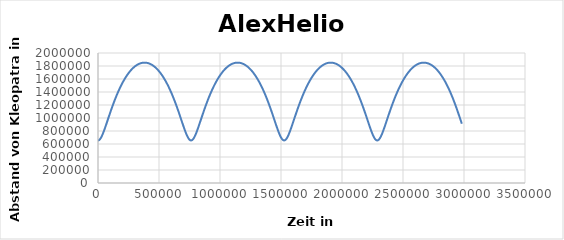
| Category | AlexHelios |
|---|---|
| 0.0 | 655000 |
| 3000.0 | 655668.459 |
| 6000.0 | 657666.917 |
| 9000.0 | 660974.897 |
| 12000.0 | 665559.148 |
| 15000.0 | 671374.895 |
| 18000.0 | 678367.433 |
| 21000.0 | 686473.949 |
| 24000.0 | 695625.447 |
| 27000.0 | 705748.665 |
| 30000.0 | 716767.876 |
| 33000.0 | 728606.511 |
| 36000.0 | 741188.56 |
| 39000.0 | 754439.718 |
| 42000.0 | 768288.295 |
| 45000.0 | 782665.887 |
| 48000.0 | 797507.843 |
| 51000.0 | 812753.552 |
| 54000.0 | 828346.585 |
| 57000.0 | 844234.711 |
| 60000.0 | 860369.83 |
| 63000.0 | 876707.841 |
| 66000.0 | 893208.449 |
| 69000.0 | 909834.961 |
| 72000.0 | 926554.046 |
| 75000.0 | 943335.501 |
| 78000.0 | 960152.01 |
| 81000.0 | 976978.912 |
| 84000.0 | 993793.973 |
| 87000.0 | 1010577.176 |
| 90000.0 | 1027310.524 |
| 93000.0 | 1043977.849 |
| 96000.0 | 1060564.643 |
| 99000.0 | 1077057.905 |
| 102000.0 | 1093445.988 |
| 105000.0 | 1109718.476 |
| 108000.0 | 1125866.06 |
| 111000.0 | 1141880.431 |
| 114000.0 | 1157754.18 |
| 117000.0 | 1173480.712 |
| 120000.0 | 1189054.166 |
| 123000.0 | 1204469.337 |
| 126000.0 | 1219721.62 |
| 129000.0 | 1234806.941 |
| 132000.0 | 1249721.713 |
| 135000.0 | 1264462.783 |
| 138000.0 | 1279027.388 |
| 141000.0 | 1293413.119 |
| 144000.0 | 1307617.887 |
| 147000.0 | 1321639.888 |
| 150000.0 | 1335477.575 |
| 153000.0 | 1349129.636 |
| 156000.0 | 1362594.964 |
| 159000.0 | 1375872.644 |
| 162000.0 | 1388961.928 |
| 165000.0 | 1401862.22 |
| 168000.0 | 1414573.062 |
| 171000.0 | 1427094.118 |
| 174000.0 | 1439425.161 |
| 177000.0 | 1451566.063 |
| 180000.0 | 1463516.784 |
| 183000.0 | 1475277.363 |
| 186000.0 | 1486847.91 |
| 189000.0 | 1498228.594 |
| 192000.0 | 1509419.644 |
| 195000.0 | 1520421.334 |
| 198000.0 | 1531233.984 |
| 201000.0 | 1541857.951 |
| 204000.0 | 1552293.624 |
| 207000.0 | 1562541.424 |
| 210000.0 | 1572601.793 |
| 213000.0 | 1582475.198 |
| 216000.0 | 1592162.121 |
| 219000.0 | 1601663.063 |
| 222000.0 | 1610978.534 |
| 225000.0 | 1620109.054 |
| 228000.0 | 1629055.155 |
| 231000.0 | 1637817.369 |
| 234000.0 | 1646396.237 |
| 237000.0 | 1654792.299 |
| 240000.0 | 1663006.097 |
| 243000.0 | 1671038.172 |
| 246000.0 | 1678889.064 |
| 249000.0 | 1686559.309 |
| 252000.0 | 1694049.439 |
| 255000.0 | 1701359.981 |
| 258000.0 | 1708491.457 |
| 261000.0 | 1715444.382 |
| 264000.0 | 1722219.261 |
| 267000.0 | 1728816.596 |
| 270000.0 | 1735236.875 |
| 273000.0 | 1741480.582 |
| 276000.0 | 1747548.187 |
| 279000.0 | 1753440.152 |
| 282000.0 | 1759156.929 |
| 285000.0 | 1764698.958 |
| 288000.0 | 1770066.669 |
| 291000.0 | 1775260.479 |
| 294000.0 | 1780280.796 |
| 297000.0 | 1785128.013 |
| 300000.0 | 1789802.514 |
| 303000.0 | 1794304.667 |
| 306000.0 | 1798634.831 |
| 309000.0 | 1802793.35 |
| 312000.0 | 1806780.558 |
| 315000.0 | 1810596.772 |
| 318000.0 | 1814242.301 |
| 321000.0 | 1817717.436 |
| 324000.0 | 1821022.458 |
| 327000.0 | 1824157.635 |
| 330000.0 | 1827123.219 |
| 333000.0 | 1829919.451 |
| 336000.0 | 1832546.557 |
| 339000.0 | 1835004.752 |
| 342000.0 | 1837294.235 |
| 345000.0 | 1839415.192 |
| 348000.0 | 1841367.796 |
| 351000.0 | 1843152.207 |
| 354000.0 | 1844768.569 |
| 357000.0 | 1846217.016 |
| 360000.0 | 1847497.665 |
| 363000.0 | 1848610.621 |
| 366000.0 | 1849555.975 |
| 369000.0 | 1850333.804 |
| 372000.0 | 1850944.172 |
| 375000.0 | 1851387.129 |
| 378000.0 | 1851662.712 |
| 381000.0 | 1851770.942 |
| 384000.0 | 1851711.829 |
| 387000.0 | 1851485.367 |
| 390000.0 | 1851091.539 |
| 393000.0 | 1850530.312 |
| 396000.0 | 1849801.64 |
| 399000.0 | 1848905.463 |
| 402000.0 | 1847841.708 |
| 405000.0 | 1846610.289 |
| 408000.0 | 1845211.104 |
| 411000.0 | 1843644.039 |
| 414000.0 | 1841908.966 |
| 417000.0 | 1840005.744 |
| 420000.0 | 1837934.217 |
| 423000.0 | 1835694.217 |
| 426000.0 | 1833285.56 |
| 429000.0 | 1830708.052 |
| 432000.0 | 1827961.483 |
| 435000.0 | 1825045.629 |
| 438000.0 | 1821960.255 |
| 441000.0 | 1818705.111 |
| 444000.0 | 1815279.934 |
| 447000.0 | 1811684.447 |
| 450000.0 | 1807918.361 |
| 453000.0 | 1803981.374 |
| 456000.0 | 1799873.17 |
| 459000.0 | 1795593.42 |
| 462000.0 | 1791141.783 |
| 465000.0 | 1786517.906 |
| 468000.0 | 1781721.422 |
| 471000.0 | 1776751.952 |
| 474000.0 | 1771609.104 |
| 477000.0 | 1766292.477 |
| 480000.0 | 1760801.656 |
| 483000.0 | 1755136.214 |
| 486000.0 | 1749295.714 |
| 489000.0 | 1743279.709 |
| 492000.0 | 1737087.738 |
| 495000.0 | 1730719.333 |
| 498000.0 | 1724174.016 |
| 501000.0 | 1717451.299 |
| 504000.0 | 1710550.684 |
| 507000.0 | 1703471.668 |
| 510000.0 | 1696213.736 |
| 513000.0 | 1688776.371 |
| 516000.0 | 1681159.046 |
| 519000.0 | 1673361.231 |
| 522000.0 | 1665382.39 |
| 525000.0 | 1657221.985 |
| 528000.0 | 1648879.476 |
| 531000.0 | 1640354.319 |
| 534000.0 | 1631645.974 |
| 537000.0 | 1622753.902 |
| 540000.0 | 1613677.565 |
| 543000.0 | 1604416.433 |
| 546000.0 | 1594969.982 |
| 549000.0 | 1585337.698 |
| 552000.0 | 1575519.078 |
| 555000.0 | 1565513.633 |
| 558000.0 | 1555320.893 |
| 561000.0 | 1544940.407 |
| 564000.0 | 1534371.747 |
| 567000.0 | 1523614.516 |
| 570000.0 | 1512668.345 |
| 573000.0 | 1501532.905 |
| 576000.0 | 1490207.905 |
| 579000.0 | 1478693.105 |
| 582000.0 | 1466988.316 |
| 585000.0 | 1455093.411 |
| 588000.0 | 1443008.328 |
| 591000.0 | 1430733.084 |
| 594000.0 | 1418267.779 |
| 597000.0 | 1405612.611 |
| 600000.0 | 1392767.882 |
| 603000.0 | 1379734.013 |
| 606000.0 | 1366511.559 |
| 609000.0 | 1353101.219 |
| 612000.0 | 1339503.861 |
| 615000.0 | 1325720.53 |
| 618000.0 | 1311752.477 |
| 621000.0 | 1297601.178 |
| 624000.0 | 1283268.357 |
| 627000.0 | 1268756.018 |
| 630000.0 | 1254066.473 |
| 633000.0 | 1239202.375 |
| 636000.0 | 1224166.759 |
| 639000.0 | 1208963.081 |
| 642000.0 | 1193595.266 |
| 645000.0 | 1178067.758 |
| 648000.0 | 1162385.579 |
| 651000.0 | 1146554.389 |
| 654000.0 | 1130580.562 |
| 657000.0 | 1114471.258 |
| 660000.0 | 1098234.512 |
| 663000.0 | 1081879.328 |
| 666000.0 | 1065415.787 |
| 669000.0 | 1048855.16 |
| 672000.0 | 1032210.038 |
| 675000.0 | 1015494.47 |
| 678000.0 | 998724.118 |
| 681000.0 | 981916.427 |
| 684000.0 | 965090.798 |
| 687000.0 | 948268.794 |
| 690000.0 | 931474.342 |
| 693000.0 | 914733.953 |
| 696000.0 | 898076.959 |
| 699000.0 | 881535.747 |
| 702000.0 | 865146 |
| 705000.0 | 848946.932 |
| 708000.0 | 832981.507 |
| 711000.0 | 817296.633 |
| 714000.0 | 801943.319 |
| 717000.0 | 786976.759 |
| 720000.0 | 772456.347 |
| 723000.0 | 758445.569 |
| 726000.0 | 745011.767 |
| 729000.0 | 732225.727 |
| 732000.0 | 720161.069 |
| 735000.0 | 708893.412 |
| 738000.0 | 698499.295 |
| 741000.0 | 689054.851 |
| 744000.0 | 680634.245 |
| 747000.0 | 673307.92 |
| 750000.0 | 667140.704 |
| 753000.0 | 662189.88 |
| 756000.0 | 658503.315 |
| 759000.0 | 656117.789 |
| 762000.0 | 655057.631 |
| 765000.0 | 655333.793 |
| 768000.0 | 656943.414 |
| 771000.0 | 659869.936 |
| 774000.0 | 664083.746 |
| 777000.0 | 669543.301 |
| 780000.0 | 676196.628 |
| 783000.0 | 683983.097 |
| 786000.0 | 692835.325 |
| 789000.0 | 702681.11 |
| 792000.0 | 713445.269 |
| 795000.0 | 725051.327 |
| 798000.0 | 737422.978 |
| 801000.0 | 750485.312 |
| 804000.0 | 764165.792 |
| 807000.0 | 778394.991 |
| 810000.0 | 793107.121 |
| 813000.0 | 808240.365 |
| 816000.0 | 823737.058 |
| 819000.0 | 839543.741 |
| 822000.0 | 855611.114 |
| 825000.0 | 871893.918 |
| 828000.0 | 888350.764 |
| 831000.0 | 904943.924 |
| 834000.0 | 921639.104 |
| 837000.0 | 938405.21 |
| 840000.0 | 955214.102 |
| 843000.0 | 972040.363 |
| 846000.0 | 988861.07 |
| 849000.0 | 1005655.576 |
| 852000.0 | 1022405.312 |
| 855000.0 | 1039093.59 |
| 858000.0 | 1055705.433 |
| 861000.0 | 1072227.413 |
| 864000.0 | 1088647.499 |
| 867000.0 | 1104954.928 |
| 870000.0 | 1121140.077 |
| 873000.0 | 1137194.353 |
| 876000.0 | 1153110.094 |
| 879000.0 | 1168880.475 |
| 882000.0 | 1184499.425 |
| 885000.0 | 1199961.557 |
| 888000.0 | 1215262.094 |
| 891000.0 | 1230396.812 |
| 894000.0 | 1245361.988 |
| 897000.0 | 1260154.343 |
| 900000.0 | 1274771.007 |
| 903000.0 | 1289209.469 |
| 906000.0 | 1303467.551 |
| 909000.0 | 1317543.367 |
| 912000.0 | 1331435.298 |
| 915000.0 | 1345141.964 |
| 918000.0 | 1358662.203 |
| 921000.0 | 1371995.044 |
| 924000.0 | 1385139.691 |
| 927000.0 | 1398095.508 |
| 930000.0 | 1410861.995 |
| 933000.0 | 1423438.783 |
| 936000.0 | 1435825.614 |
| 939000.0 | 1448022.331 |
| 942000.0 | 1460028.871 |
| 945000.0 | 1471845.25 |
| 948000.0 | 1483471.558 |
| 951000.0 | 1494907.947 |
| 954000.0 | 1506154.63 |
| 957000.0 | 1517211.867 |
| 960000.0 | 1528079.966 |
| 963000.0 | 1538759.274 |
| 966000.0 | 1549250.171 |
| 969000.0 | 1559553.068 |
| 972000.0 | 1569668.402 |
| 975000.0 | 1579596.633 |
| 978000.0 | 1589338.239 |
| 981000.0 | 1598893.715 |
| 984000.0 | 1608263.569 |
| 987000.0 | 1617448.32 |
| 990000.0 | 1626448.494 |
| 993000.0 | 1635264.624 |
| 996000.0 | 1643897.25 |
| 999000.0 | 1652346.91 |
| 1002000.0 | 1660614.148 |
| 1005000.0 | 1668699.504 |
| 1008000.0 | 1676603.519 |
| 1011000.0 | 1684326.73 |
| 1014000.0 | 1691869.67 |
| 1017000.0 | 1699232.869 |
| 1020000.0 | 1706416.849 |
| 1023000.0 | 1713422.126 |
| 1026000.0 | 1720249.211 |
| 1029000.0 | 1726898.605 |
| 1032000.0 | 1733370.802 |
| 1035000.0 | 1739666.284 |
| 1038000.0 | 1745785.528 |
| 1041000.0 | 1751728.998 |
| 1044000.0 | 1757497.147 |
| 1047000.0 | 1763090.421 |
| 1050000.0 | 1768509.252 |
| 1053000.0 | 1773754.061 |
| 1056000.0 | 1778825.258 |
| 1059000.0 | 1783723.241 |
| 1062000.0 | 1788448.397 |
| 1065000.0 | 1793001.097 |
| 1068000.0 | 1797381.705 |
| 1071000.0 | 1801590.569 |
| 1074000.0 | 1805628.024 |
| 1077000.0 | 1809494.394 |
| 1080000.0 | 1813189.989 |
| 1083000.0 | 1816715.106 |
| 1086000.0 | 1820070.03 |
| 1089000.0 | 1823255.03 |
| 1092000.0 | 1826270.366 |
| 1095000.0 | 1829116.28 |
| 1098000.0 | 1831793.003 |
| 1101000.0 | 1834300.753 |
| 1104000.0 | 1836639.734 |
| 1107000.0 | 1838810.137 |
| 1110000.0 | 1840812.137 |
| 1113000.0 | 1842645.898 |
| 1116000.0 | 1844311.57 |
| 1119000.0 | 1845809.288 |
| 1122000.0 | 1847139.175 |
| 1125000.0 | 1848301.34 |
| 1128000.0 | 1849295.878 |
| 1131000.0 | 1850122.87 |
| 1134000.0 | 1850782.384 |
| 1137000.0 | 1851274.473 |
| 1140000.0 | 1851599.178 |
| 1143000.0 | 1851756.526 |
| 1146000.0 | 1851746.529 |
| 1149000.0 | 1851569.187 |
| 1152000.0 | 1851224.485 |
| 1155000.0 | 1850712.395 |
| 1158000.0 | 1850032.875 |
| 1161000.0 | 1849185.869 |
| 1164000.0 | 1848171.308 |
| 1167000.0 | 1846989.109 |
| 1170000.0 | 1845639.176 |
| 1173000.0 | 1844121.398 |
| 1176000.0 | 1842435.651 |
| 1179000.0 | 1840581.797 |
| 1182000.0 | 1838559.686 |
| 1185000.0 | 1836369.152 |
| 1188000.0 | 1834010.017 |
| 1191000.0 | 1831482.09 |
| 1194000.0 | 1828785.163 |
| 1197000.0 | 1825919.02 |
| 1200000.0 | 1822883.427 |
| 1203000.0 | 1819678.138 |
| 1206000.0 | 1816302.895 |
| 1209000.0 | 1812757.425 |
| 1212000.0 | 1809041.442 |
| 1215000.0 | 1805154.648 |
| 1218000.0 | 1801096.731 |
| 1221000.0 | 1796867.366 |
| 1224000.0 | 1792466.215 |
| 1227000.0 | 1787892.93 |
| 1230000.0 | 1783147.146 |
| 1233000.0 | 1778228.488 |
| 1236000.0 | 1773136.57 |
| 1239000.0 | 1767870.991 |
| 1242000.0 | 1762431.34 |
| 1245000.0 | 1756817.196 |
| 1248000.0 | 1751028.123 |
| 1251000.0 | 1745063.677 |
| 1254000.0 | 1738923.401 |
| 1257000.0 | 1732606.831 |
| 1260000.0 | 1726113.489 |
| 1263000.0 | 1719442.891 |
| 1266000.0 | 1712594.543 |
| 1269000.0 | 1705567.941 |
| 1272000.0 | 1698362.576 |
| 1275000.0 | 1690977.931 |
| 1278000.0 | 1683413.48 |
| 1281000.0 | 1675668.696 |
| 1284000.0 | 1667743.043 |
| 1287000.0 | 1659635.984 |
| 1290000.0 | 1651346.98 |
| 1293000.0 | 1642875.488 |
| 1296000.0 | 1634220.966 |
| 1299000.0 | 1625382.875 |
| 1302000.0 | 1616360.677 |
| 1305000.0 | 1607153.838 |
| 1308000.0 | 1597761.834 |
| 1311000.0 | 1588184.146 |
| 1314000.0 | 1578420.268 |
| 1317000.0 | 1568469.707 |
| 1320000.0 | 1558331.987 |
| 1323000.0 | 1548006.652 |
| 1326000.0 | 1537493.265 |
| 1329000.0 | 1526791.421 |
| 1332000.0 | 1515900.741 |
| 1335000.0 | 1504820.885 |
| 1338000.0 | 1493551.55 |
| 1341000.0 | 1482092.48 |
| 1344000.0 | 1470443.47 |
| 1347000.0 | 1458604.375 |
| 1350000.0 | 1446575.112 |
| 1353000.0 | 1434355.675 |
| 1356000.0 | 1421946.139 |
| 1359000.0 | 1409346.671 |
| 1362000.0 | 1396557.541 |
| 1365000.0 | 1383579.135 |
| 1368000.0 | 1370411.966 |
| 1371000.0 | 1357056.691 |
| 1374000.0 | 1343514.124 |
| 1377000.0 | 1329785.257 |
| 1380000.0 | 1315871.279 |
| 1383000.0 | 1301773.597 |
| 1386000.0 | 1287493.859 |
| 1389000.0 | 1273033.985 |
| 1392000.0 | 1258396.192 |
| 1395000.0 | 1243583.03 |
| 1398000.0 | 1228597.417 |
| 1401000.0 | 1213442.682 |
| 1404000.0 | 1198122.606 |
| 1407000.0 | 1182641.476 |
| 1410000.0 | 1167004.136 |
| 1413000.0 | 1151216.055 |
| 1416000.0 | 1135283.388 |
| 1419000.0 | 1119213.055 |
| 1422000.0 | 1103012.825 |
| 1425000.0 | 1086691.409 |
| 1428000.0 | 1070258.559 |
| 1431000.0 | 1053725.184 |
| 1434000.0 | 1037103.473 |
| 1437000.0 | 1020407.032 |
| 1440000.0 | 1003651.034 |
| 1443000.0 | 986852.382 |
| 1446000.0 | 970029.883 |
| 1449000.0 | 953204.444 |
| 1452000.0 | 936399.276 |
| 1455000.0 | 919640.108 |
| 1458000.0 | 902955.421 |
| 1461000.0 | 886376.678 |
| 1464000.0 | 869938.572 |
| 1467000.0 | 853679.255 |
| 1470000.0 | 837640.57 |
| 1473000.0 | 821868.249 |
| 1476000.0 | 806412.086 |
| 1479000.0 | 791326.039 |
| 1482000.0 | 776668.277 |
| 1485000.0 | 762501.101 |
| 1488000.0 | 748890.757 |
| 1491000.0 | 735907.073 |
| 1494000.0 | 723622.915 |
| 1497000.0 | 712113.415 |
| 1500000.0 | 701454.968 |
| 1503000.0 | 691723.977 |
| 1506000.0 | 682995.362 |
| 1509000.0 | 675340.847 |
| 1512000.0 | 668827.111 |
| 1515000.0 | 663513.849 |
| 1518000.0 | 659451.876 |
| 1521000.0 | 656681.383 |
| 1524000.0 | 655230.473 |
| 1527000.0 | 655114.092 |
| 1530000.0 | 656333.444 |
| 1533000.0 | 658875.949 |
| 1536000.0 | 662715.73 |
| 1539000.0 | 667814.603 |
| 1542000.0 | 674123.484 |
| 1545000.0 | 681584.088 |
| 1548000.0 | 690130.814 |
| 1551000.0 | 699692.678 |
| 1554000.0 | 710195.188 |
| 1557000.0 | 721562.087 |
| 1560000.0 | 733716.881 |
| 1563000.0 | 746584.137 |
| 1566000.0 | 760090.535 |
| 1569000.0 | 774165.672 |
| 1572000.0 | 788742.649 |
| 1575000.0 | 803758.459 |
| 1578000.0 | 819154.208 |
| 1581000.0 | 834875.202 |
| 1584000.0 | 850870.93 |
| 1587000.0 | 867094.965 |
| 1590000.0 | 883504.799 |
| 1593000.0 | 900061.654 |
| 1596000.0 | 916730.253 |
| 1599000.0 | 933478.587 |
| 1602000.0 | 950277.673 |
| 1605000.0 | 967101.32 |
| 1608000.0 | 983925.896 |
| 1611000.0 | 1000730.107 |
| 1614000.0 | 1017494.794 |
| 1617000.0 | 1034202.736 |
| 1620000.0 | 1050838.472 |
| 1623000.0 | 1067388.135 |
| 1626000.0 | 1083839.298 |
| 1629000.0 | 1100180.839 |
| 1632000.0 | 1116402.813 |
| 1635000.0 | 1132496.335 |
| 1638000.0 | 1148453.481 |
| 1641000.0 | 1164267.187 |
| 1644000.0 | 1179931.172 |
| 1647000.0 | 1195439.853 |
| 1650000.0 | 1210788.28 |
| 1653000.0 | 1225972.075 |
| 1656000.0 | 1240987.372 |
| 1659000.0 | 1255830.766 |
| 1662000.0 | 1270499.272 |
| 1665000.0 | 1284990.278 |
| 1668000.0 | 1299301.511 |
| 1671000.0 | 1313431.003 |
| 1674000.0 | 1327377.058 |
| 1677000.0 | 1341138.231 |
| 1680000.0 | 1354713.297 |
| 1683000.0 | 1368101.23 |
| 1686000.0 | 1381301.187 |
| 1689000.0 | 1394312.485 |
| 1692000.0 | 1407134.585 |
| 1695000.0 | 1419767.083 |
| 1698000.0 | 1432209.688 |
| 1701000.0 | 1444462.216 |
| 1704000.0 | 1456524.576 |
| 1707000.0 | 1468396.763 |
| 1710000.0 | 1480078.845 |
| 1713000.0 | 1491570.957 |
| 1716000.0 | 1502873.295 |
| 1719000.0 | 1513986.106 |
| 1722000.0 | 1524909.685 |
| 1725000.0 | 1535644.366 |
| 1728000.0 | 1546190.521 |
| 1731000.0 | 1556548.554 |
| 1734000.0 | 1566718.892 |
| 1737000.0 | 1576701.99 |
| 1740000.0 | 1586498.322 |
| 1743000.0 | 1596108.377 |
| 1746000.0 | 1605532.659 |
| 1749000.0 | 1614771.685 |
| 1752000.0 | 1623825.978 |
| 1755000.0 | 1632696.071 |
| 1758000.0 | 1641382.501 |
| 1761000.0 | 1649885.807 |
| 1764000.0 | 1658206.531 |
| 1767000.0 | 1666345.215 |
| 1770000.0 | 1674302.399 |
| 1773000.0 | 1682078.622 |
| 1776000.0 | 1689674.418 |
| 1779000.0 | 1697090.317 |
| 1782000.0 | 1704326.845 |
| 1785000.0 | 1711384.52 |
| 1788000.0 | 1718263.854 |
| 1791000.0 | 1724965.35 |
| 1794000.0 | 1731489.505 |
| 1797000.0 | 1737836.805 |
| 1800000.0 | 1744007.727 |
| 1803000.0 | 1750002.74 |
| 1806000.0 | 1755822.301 |
| 1809000.0 | 1761466.857 |
| 1812000.0 | 1766936.844 |
| 1815000.0 | 1772232.687 |
| 1818000.0 | 1777354.799 |
| 1821000.0 | 1782303.581 |
| 1824000.0 | 1787079.423 |
| 1827000.0 | 1791682.703 |
| 1830000.0 | 1796113.784 |
| 1833000.0 | 1800373.021 |
| 1836000.0 | 1804460.752 |
| 1839000.0 | 1808377.304 |
| 1842000.0 | 1812122.991 |
| 1845000.0 | 1815698.115 |
| 1848000.0 | 1819102.963 |
| 1851000.0 | 1822337.81 |
| 1854000.0 | 1825402.918 |
| 1857000.0 | 1828298.533 |
| 1860000.0 | 1831024.892 |
| 1863000.0 | 1833582.216 |
| 1866000.0 | 1835970.712 |
| 1869000.0 | 1838190.574 |
| 1872000.0 | 1840241.984 |
| 1875000.0 | 1842125.109 |
| 1878000.0 | 1843840.101 |
| 1881000.0 | 1845387.102 |
| 1884000.0 | 1846766.237 |
| 1887000.0 | 1847977.62 |
| 1890000.0 | 1849021.348 |
| 1893000.0 | 1849897.509 |
| 1896000.0 | 1850606.172 |
| 1899000.0 | 1851147.397 |
| 1902000.0 | 1851521.227 |
| 1905000.0 | 1851727.694 |
| 1908000.0 | 1851766.813 |
| 1911000.0 | 1851638.589 |
| 1914000.0 | 1851343.011 |
| 1917000.0 | 1850880.054 |
| 1920000.0 | 1850249.681 |
| 1923000.0 | 1849451.84 |
| 1926000.0 | 1848486.466 |
| 1929000.0 | 1847353.48 |
| 1932000.0 | 1846052.789 |
| 1935000.0 | 1844584.287 |
| 1938000.0 | 1842947.854 |
| 1941000.0 | 1841143.356 |
| 1944000.0 | 1839170.646 |
| 1947000.0 | 1837029.563 |
| 1950000.0 | 1834719.933 |
| 1953000.0 | 1832241.568 |
| 1956000.0 | 1829594.267 |
| 1959000.0 | 1826777.813 |
| 1962000.0 | 1823791.98 |
| 1965000.0 | 1820636.525 |
| 1968000.0 | 1817311.192 |
| 1971000.0 | 1813815.714 |
| 1974000.0 | 1810149.808 |
| 1977000.0 | 1806313.18 |
| 1980000.0 | 1802305.522 |
| 1983000.0 | 1798126.513 |
| 1986000.0 | 1793775.819 |
| 1989000.0 | 1789253.093 |
| 1992000.0 | 1784557.977 |
| 1995000.0 | 1779690.099 |
| 1998000.0 | 1774649.074 |
| 2001000.0 | 1769434.508 |
| 2004000.0 | 1764045.993 |
| 2007000.0 | 1758483.108 |
| 2010000.0 | 1752745.424 |
| 2013000.0 | 1746832.498 |
| 2016000.0 | 1740743.877 |
| 2019000.0 | 1734479.1 |
| 2022000.0 | 1728037.692 |
| 2025000.0 | 1721419.171 |
| 2028000.0 | 1714623.045 |
| 2031000.0 | 1707648.815 |
| 2034000.0 | 1700495.972 |
| 2037000.0 | 1693164.001 |
| 2040000.0 | 1685652.379 |
| 2043000.0 | 1677960.579 |
| 2046000.0 | 1670088.068 |
| 2049000.0 | 1662034.309 |
| 2052000.0 | 1653798.764 |
| 2055000.0 | 1645380.889 |
| 2058000.0 | 1636780.144 |
| 2061000.0 | 1627995.988 |
| 2064000.0 | 1619027.882 |
| 2067000.0 | 1609875.292 |
| 2070000.0 | 1600537.689 |
| 2073000.0 | 1591014.554 |
| 2076000.0 | 1581305.376 |
| 2079000.0 | 1571409.658 |
| 2082000.0 | 1561326.919 |
| 2085000.0 | 1551056.696 |
| 2088000.0 | 1540598.548 |
| 2091000.0 | 1529952.058 |
| 2094000.0 | 1519116.84 |
| 2097000.0 | 1508092.542 |
| 2100000.0 | 1496878.849 |
| 2103000.0 | 1485475.491 |
| 2106000.0 | 1473882.248 |
| 2109000.0 | 1462098.956 |
| 2112000.0 | 1450125.513 |
| 2115000.0 | 1437961.89 |
| 2118000.0 | 1425608.136 |
| 2121000.0 | 1413064.392 |
| 2124000.0 | 1400330.895 |
| 2127000.0 | 1387407.995 |
| 2130000.0 | 1374296.169 |
| 2133000.0 | 1360996.027 |
| 2136000.0 | 1347508.337 |
| 2139000.0 | 1333834.036 |
| 2142000.0 | 1319974.254 |
| 2145000.0 | 1305930.331 |
| 2148000.0 | 1291703.842 |
| 2151000.0 | 1277296.623 |
| 2154000.0 | 1262710.802 |
| 2157000.0 | 1247948.826 |
| 2160000.0 | 1233013.503 |
| 2163000.0 | 1217908.036 |
| 2166000.0 | 1202636.068 |
| 2169000.0 | 1187201.732 |
| 2172000.0 | 1171609.703 |
| 2175000.0 | 1155865.26 |
| 2178000.0 | 1139974.348 |
| 2181000.0 | 1123943.655 |
| 2184000.0 | 1107780.692 |
| 2187000.0 | 1091493.883 |
| 2190000.0 | 1075092.662 |
| 2193000.0 | 1058587.588 |
| 2196000.0 | 1041990.459 |
| 2199000.0 | 1025314.452 |
| 2202000.0 | 1008574.263 |
| 2205000.0 | 991786.269 |
| 2208000.0 | 974968.699 |
| 2211000.0 | 958141.824 |
| 2214000.0 | 941328.155 |
| 2217000.0 | 924552.661 |
| 2220000.0 | 907842.988 |
| 2223000.0 | 891229.702 |
| 2226000.0 | 874746.521 |
| 2229000.0 | 858430.559 |
| 2232000.0 | 842322.553 |
| 2235000.0 | 826467.074 |
| 2238000.0 | 810912.709 |
| 2241000.0 | 795712.187 |
| 2244000.0 | 780922.443 |
| 2247000.0 | 766604.578 |
| 2250000.0 | 752823.712 |
| 2253000.0 | 739648.667 |
| 2256000.0 | 727151.487 |
| 2259000.0 | 715406.733 |
| 2262000.0 | 704490.547 |
| 2265000.0 | 694479.476 |
| 2268000.0 | 685449.042 |
| 2271000.0 | 677472.095 |
| 2274000.0 | 670616.993 |
| 2277000.0 | 664945.682 |
| 2280000.0 | 660511.773 |
| 2283000.0 | 657358.742 |
| 2286000.0 | 655518.371 |
| 2289000.0 | 655009.55 |
| 2292000.0 | 655837.547 |
| 2295000.0 | 657993.8 |
| 2298000.0 | 661456.252 |
| 2301000.0 | 666190.204 |
| 2304000.0 | 672149.605 |
| 2307000.0 | 679278.681 |
| 2310000.0 | 687513.777 |
| 2313000.0 | 696785.291 |
| 2316000.0 | 707019.573 |
| 2319000.0 | 718140.715 |
| 2322000.0 | 730072.146 |
| 2325000.0 | 742738.002 |
| 2328000.0 | 756064.249 |
| 2331000.0 | 769979.559 |
| 2334000.0 | 784415.955 |
| 2337000.0 | 799309.257 |
| 2340000.0 | 814599.349 |
| 2343000.0 | 830230.304 |
| 2346000.0 | 846150.389 |
| 2349000.0 | 862311.993 |
| 2352000.0 | 878671.477 |
| 2355000.0 | 895188.99 |
| 2358000.0 | 911828.251 |
| 2361000.0 | 928556.318 |
| 2364000.0 | 945343.344 |
| 2367000.0 | 962162.343 |
| 2370000.0 | 978988.953 |
| 2373000.0 | 995801.219 |
| 2376000.0 | 1012579.376 |
| 2379000.0 | 1029305.651 |
| 2382000.0 | 1045964.087 |
| 2385000.0 | 1062540.362 |
| 2388000.0 | 1079021.645 |
| 2391000.0 | 1095396.442 |
| 2394000.0 | 1111654.477 |
| 2397000.0 | 1127786.563 |
| 2400000.0 | 1143784.506 |
| 2403000.0 | 1159640.998 |
| 2406000.0 | 1175349.535 |
| 2409000.0 | 1190904.339 |
| 2412000.0 | 1206300.28 |
| 2415000.0 | 1221532.819 |
| 2418000.0 | 1236597.944 |
| 2421000.0 | 1251492.121 |
| 2424000.0 | 1266212.245 |
| 2427000.0 | 1280755.598 |
| 2430000.0 | 1295119.813 |
| 2433000.0 | 1309302.834 |
| 2436000.0 | 1323302.891 |
| 2439000.0 | 1337118.465 |
| 2442000.0 | 1350748.269 |
| 2445000.0 | 1364191.222 |
| 2448000.0 | 1377446.429 |
| 2451000.0 | 1390513.162 |
| 2454000.0 | 1403390.841 |
| 2457000.0 | 1416079.024 |
| 2460000.0 | 1428577.387 |
| 2463000.0 | 1440885.717 |
| 2466000.0 | 1453003.898 |
| 2469000.0 | 1464931.898 |
| 2472000.0 | 1476669.766 |
| 2475000.0 | 1488217.618 |
| 2478000.0 | 1499575.633 |
| 2481000.0 | 1510744.043 |
| 2484000.0 | 1521723.13 |
| 2487000.0 | 1532513.217 |
| 2490000.0 | 1543114.666 |
| 2493000.0 | 1553527.87 |
| 2496000.0 | 1563753.252 |
| 2499000.0 | 1573791.259 |
| 2502000.0 | 1583642.358 |
| 2505000.0 | 1593307.034 |
| 2508000.0 | 1602785.789 |
| 2511000.0 | 1612079.135 |
| 2514000.0 | 1621187.594 |
| 2517000.0 | 1630111.696 |
| 2520000.0 | 1638851.976 |
| 2523000.0 | 1647408.975 |
| 2526000.0 | 1655783.232 |
| 2529000.0 | 1663975.29 |
| 2532000.0 | 1671985.689 |
| 2535000.0 | 1679814.97 |
| 2538000.0 | 1687463.668 |
| 2541000.0 | 1694932.314 |
| 2544000.0 | 1702221.435 |
| 2547000.0 | 1709331.551 |
| 2550000.0 | 1716263.177 |
| 2553000.0 | 1723016.818 |
| 2556000.0 | 1729592.973 |
| 2559000.0 | 1735992.131 |
| 2562000.0 | 1742214.772 |
| 2565000.0 | 1748261.368 |
| 2568000.0 | 1754132.379 |
| 2571000.0 | 1759828.255 |
| 2574000.0 | 1765349.435 |
| 2577000.0 | 1770696.347 |
| 2580000.0 | 1775869.408 |
| 2583000.0 | 1780869.023 |
| 2586000.0 | 1785695.584 |
| 2589000.0 | 1790349.474 |
| 2592000.0 | 1794831.06 |
| 2595000.0 | 1799140.698 |
| 2598000.0 | 1803278.733 |
| 2601000.0 | 1807245.494 |
| 2604000.0 | 1811041.3 |
| 2607000.0 | 1814666.455 |
| 2610000.0 | 1818121.251 |
| 2613000.0 | 1821405.967 |
| 2616000.0 | 1824520.868 |
| 2619000.0 | 1827466.206 |
| 2622000.0 | 1830242.22 |
| 2625000.0 | 1832849.135 |
| 2628000.0 | 1835287.162 |
| 2631000.0 | 1837556.5 |
| 2634000.0 | 1839657.335 |
| 2637000.0 | 1841589.836 |
| 2640000.0 | 1843354.161 |
| 2643000.0 | 1844950.455 |
| 2646000.0 | 1846378.848 |
| 2649000.0 | 1847639.456 |
| 2652000.0 | 1848732.383 |
| 2655000.0 | 1849657.718 |
| 2658000.0 | 1850415.536 |
| 2661000.0 | 1851005.9 |
| 2664000.0 | 1851428.859 |
| 2667000.0 | 1851684.445 |
| 2670000.0 | 1851772.682 |
| 2673000.0 | 1851693.575 |
| 2676000.0 | 1851447.118 |
| 2679000.0 | 1851033.292 |
| 2682000.0 | 1850452.061 |
| 2685000.0 | 1849703.38 |
| 2688000.0 | 1848787.186 |
| 2691000.0 | 1847703.404 |
| 2694000.0 | 1846451.946 |
| 2697000.0 | 1845032.709 |
| 2700000.0 | 1843445.578 |
| 2703000.0 | 1841690.423 |
| 2706000.0 | 1839767.101 |
| 2709000.0 | 1837675.455 |
| 2712000.0 | 1835415.314 |
| 2715000.0 | 1832986.494 |
| 2718000.0 | 1830388.798 |
| 2721000.0 | 1827622.015 |
| 2724000.0 | 1824685.921 |
| 2727000.0 | 1821580.277 |
| 2730000.0 | 1818304.832 |
| 2733000.0 | 1814859.321 |
| 2736000.0 | 1811243.467 |
| 2739000.0 | 1807456.979 |
| 2742000.0 | 1803499.552 |
| 2745000.0 | 1799370.87 |
| 2748000.0 | 1795070.602 |
| 2751000.0 | 1790598.406 |
| 2754000.0 | 1785953.925 |
| 2757000.0 | 1781136.793 |
| 2760000.0 | 1776146.629 |
| 2763000.0 | 1770983.041 |
| 2766000.0 | 1765645.624 |
| 2769000.0 | 1760133.962 |
| 2772000.0 | 1754447.628 |
| 2775000.0 | 1748586.183 |
| 2778000.0 | 1742549.178 |
| 2781000.0 | 1736336.153 |
| 2784000.0 | 1729946.636 |
| 2787000.0 | 1723380.15 |
| 2790000.0 | 1716636.205 |
| 2793000.0 | 1709714.302 |
| 2796000.0 | 1702613.936 |
| 2799000.0 | 1695334.594 |
| 2802000.0 | 1687875.756 |
| 2805000.0 | 1680236.894 |
| 2808000.0 | 1672417.479 |
| 2811000.0 | 1664416.974 |
| 2814000.0 | 1656234.84 |
| 2817000.0 | 1647870.537 |
| 2820000.0 | 1639323.522 |
| 2823000.0 | 1630593.255 |
| 2826000.0 | 1621679.195 |
| 2829000.0 | 1612580.807 |
| 2832000.0 | 1603297.561 |
| 2835000.0 | 1593828.935 |
| 2838000.0 | 1584174.414 |
| 2841000.0 | 1574333.498 |
| 2844000.0 | 1564305.7 |
| 2847000.0 | 1554090.552 |
| 2850000.0 | 1543687.605 |
| 2853000.0 | 1533096.437 |
| 2856000.0 | 1522316.65 |
| 2859000.0 | 1511347.883 |
| 2862000.0 | 1500189.809 |
| 2865000.0 | 1488842.144 |
| 2868000.0 | 1477304.654 |
| 2871000.0 | 1465577.156 |
| 2874000.0 | 1453659.53 |
| 2877000.0 | 1441551.725 |
| 2880000.0 | 1429253.766 |
| 2883000.0 | 1416765.765 |
| 2886000.0 | 1404087.931 |
| 2889000.0 | 1391220.579 |
| 2892000.0 | 1378164.147 |
| 2895000.0 | 1364919.205 |
| 2898000.0 | 1351486.472 |
| 2901000.0 | 1337866.835 |
| 2904000.0 | 1324061.365 |
| 2907000.0 | 1310071.336 |
| 2910000.0 | 1295898.253 |
| 2913000.0 | 1281543.873 |
| 2916000.0 | 1267010.234 |
| 2919000.0 | 1252299.687 |
| 2922000.0 | 1237414.929 |
| 2925000.0 | 1222359.043 |
| 2928000.0 | 1207135.539 |
| 2931000.0 | 1191748.4 |
| 2934000.0 | 1176202.136 |
| 2937000.0 | 1160501.842 |
| 2940000.0 | 1144653.261 |
| 2943000.0 | 1128662.855 |
| 2946000.0 | 1112537.883 |
| 2949000.0 | 1096286.493 |
| 2952000.0 | 1079917.81 |
| 2955000.0 | 1063442.053 |
| 2958000.0 | 1046870.641 |
| 2961000.0 | 1030216.333 |
| 2964000.0 | 1013493.362 |
| 2967000.0 | 996717.595 |
| 2970000.0 | 979906.699 |
| 2973000.0 | 963080.325 |
| 2976000.0 | 946260.306 |
| 2979000.0 | 929470.864 |
| 2982000.0 | 912738.839 |